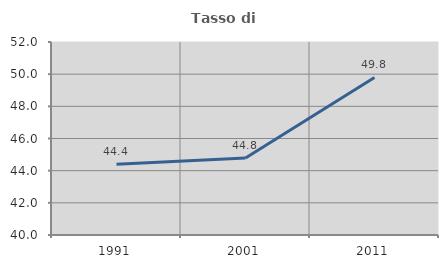
| Category | Tasso di occupazione   |
|---|---|
| 1991.0 | 44.402 |
| 2001.0 | 44.79 |
| 2011.0 | 49.795 |